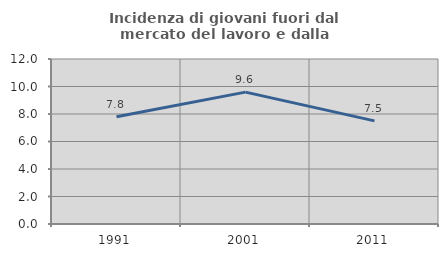
| Category | Incidenza di giovani fuori dal mercato del lavoro e dalla formazione  |
|---|---|
| 1991.0 | 7.805 |
| 2001.0 | 9.589 |
| 2011.0 | 7.5 |